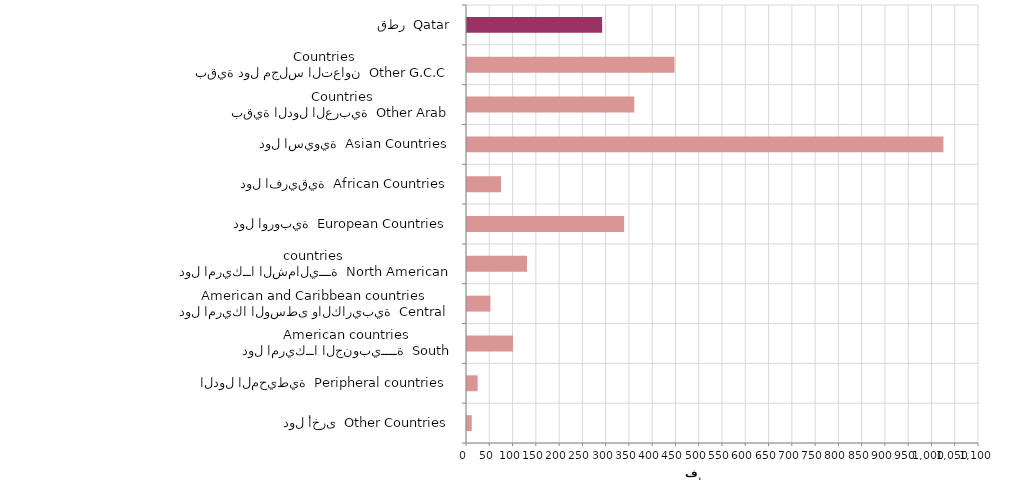
| Category | Series 0 |
|---|---|
| دول أخرى  Other Countries | 10218 |
| الدول المحيطية  Peripheral countries | 22906 |
| دول امريكــا الجنوبيــــة  South American countries | 98777 |
| دول امريكا الوسطى والكاريبية  Central American and Caribbean countries | 50370 |
| دول امريكــا الشماليـــة  North American countries  | 128859 |
| دول اوروبية  European Countries | 337645 |
| دول افريقية  African Countries | 73067 |
| دول اسيوية  Asian Countries | 1023539 |
| بقية الدول العربية  Other Arab Countries | 359401 |
| بقية دول مجلس التعاون  Other G.C.C Countries | 445863 |
| قطر  Qatar | 290323 |